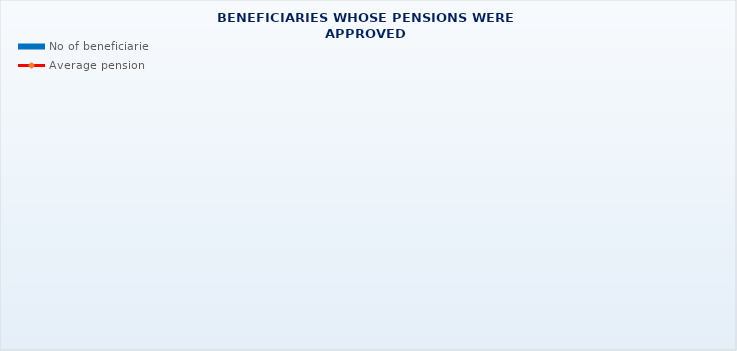
| Category | No of beneficiaries |
|---|---|
| Authorised officials in internal affairs, judicial officers and workers engaged in demining work: | 17264 |
| Pension beneficiaries entitled under the Fire Services Act (Official Gazette 125/19) | 251 |
| Active military personnel - DVO  | 15933 |
| Croatian Homeland Army veterans mobilised from 1941 to 1945 | 2454 |
| Former political prisoners | 2321 |
| Croatian Veterans from the Homeland War - ZOHBDR (Act on Croatian Homeland War Veterans and Their Family Members) | 70905 |
| Pensions approved under general regulations and determined according to the Act on the Rights of Croatian Homeland War Veterans and their Family Members (ZOHBDR), in 2017 (Art. 27, 35, 48 and 49, paragraph 2)    | 53272 |
| Former Yugoslav People's Army members - JNA   | 4204 |
| Former Yugoslav People's Army members - JNA - Art. 185 of Pension Insurance Act (ZOMO)  | 157 |
| National Liberation War veterans - NOR | 6227 |
| Members of the Croatian Parliament, members of the Government, judges of the Constitutional Court and the Auditor General | 685 |
| Members of the Parliamentary Executive Council and administratively retired federal civil servants  (relates to the former SFRY) | 72 |
| Former officials of federal bodies o the former SFRJ -  Article 38 of the Pension Insurance Act (ZOMO) | 22 |
| Full members of the Croatian Academy of Sciences and Arts - HAZU | 132 |
| Miners from the Istrian coal mines "Tupljak" d.d. Labin  | 248 |
| Workers professionally exposed to asbestos | 842 |
| Insurees - crew members on a ship in international and national navigation  - Article  129, paragraph 2 of the Maritime Code | 200 |
| Members of the Croatian Defence Council - HVO  | 6727 |